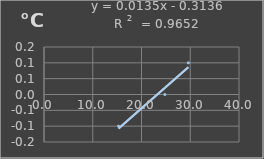
| Category | Temperatura |
|---|---|
| 15.3 | -0.1 |
| 24.8 | 0 |
| 29.6 | 0.1 |